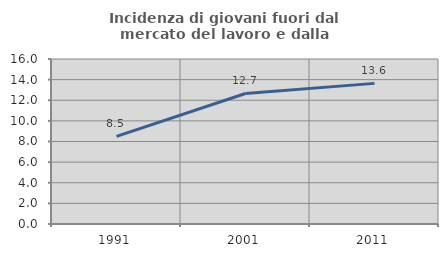
| Category | Incidenza di giovani fuori dal mercato del lavoro e dalla formazione  |
|---|---|
| 1991.0 | 8.497 |
| 2001.0 | 12.658 |
| 2011.0 | 13.636 |